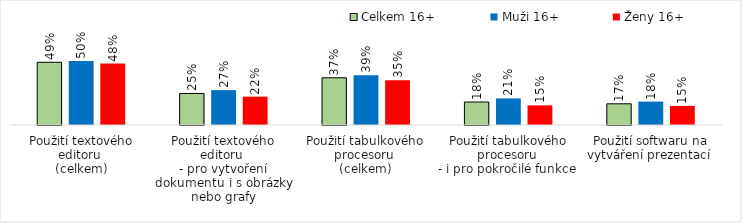
| Category | Celkem 16+ | Muži 16+ | Ženy 16+ |
|---|---|---|---|
| Použití textového editoru 
(celkem) | 0.489 | 0.499 | 0.479 |
| Použití textového editoru 
- pro vytvoření dokumentu i s obrázky nebo grafy | 0.246 | 0.272 | 0.221 |
| Použití tabulkového procesoru 
(celkem) | 0.368 | 0.388 | 0.349 |
| Použití tabulkového procesoru 
- i pro pokročilé funkce  | 0.179 | 0.207 | 0.153 |
| Použití softwaru na vytváření prezentací  | 0.165 | 0.183 | 0.149 |